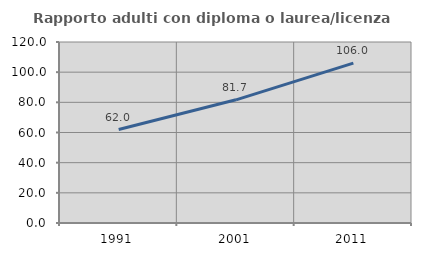
| Category | Rapporto adulti con diploma o laurea/licenza media  |
|---|---|
| 1991.0 | 61.965 |
| 2001.0 | 81.671 |
| 2011.0 | 106.017 |